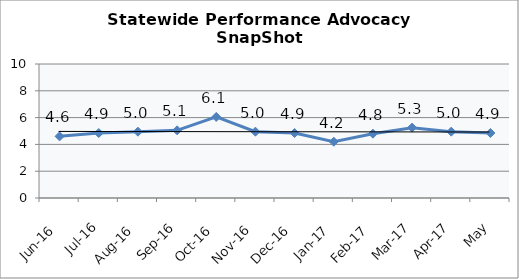
| Category | Statewide |
|---|---|
| Jun-16 | 4.6 |
| Jul-16 | 4.85 |
| Aug-16 | 4.95 |
| Sep-16 | 5.05 |
| Oct-16 | 6.05 |
| Nov-16 | 4.95 |
| Dec-16 | 4.85 |
| Jan-17 | 4.2 |
| Feb-17 | 4.8 |
| Mar-17 | 5.25 |
| Apr-17 | 4.95 |
| May | 4.85 |